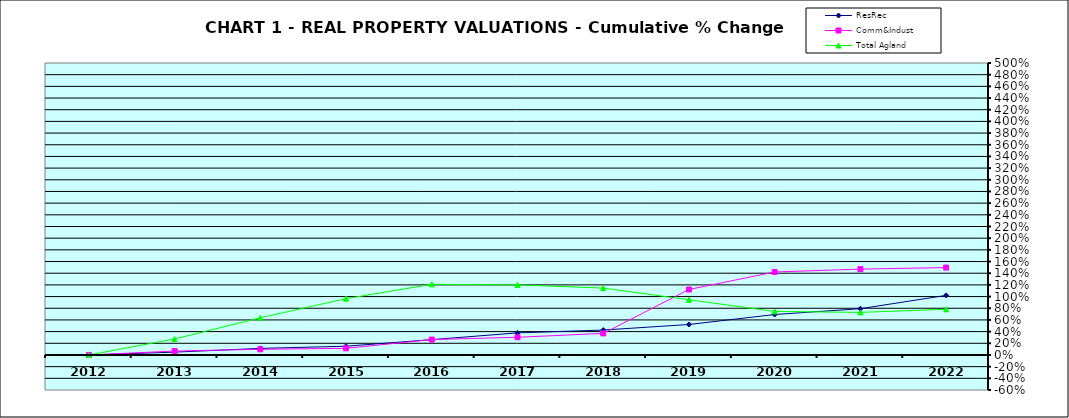
| Category | ResRec | Comm&Indust | Total Agland |
|---|---|---|---|
| 2012.0 | 0 | 0 | 0 |
| 2013.0 | 0.048 | 0.067 | 0.274 |
| 2014.0 | 0.112 | 0.097 | 0.637 |
| 2015.0 | 0.15 | 0.114 | 0.965 |
| 2016.0 | 0.263 | 0.264 | 1.21 |
| 2017.0 | 0.378 | 0.303 | 1.2 |
| 2018.0 | 0.427 | 0.369 | 1.146 |
| 2019.0 | 0.522 | 1.121 | 0.945 |
| 2020.0 | 0.692 | 1.421 | 0.745 |
| 2021.0 | 0.793 | 1.471 | 0.729 |
| 2022.0 | 1.02 | 1.497 | 0.782 |